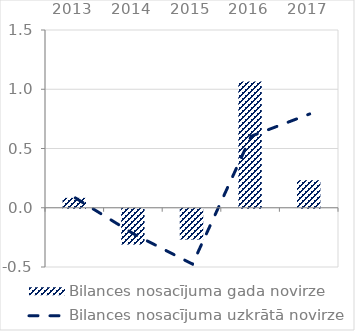
| Category | Bilances nosacījuma gada novirze |
|---|---|
| 2013.0 | 0.083 |
| 2014.0 | -0.302 |
| 2015.0 | -0.26 |
| 2016.0 | 1.066 |
| 2017.0 | 0.233 |